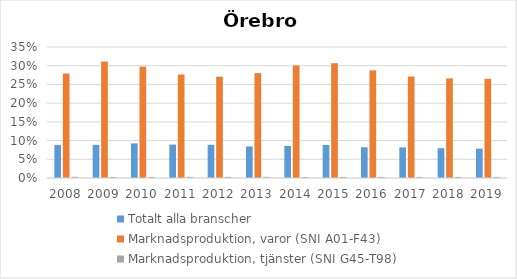
| Category | Totalt alla branscher | Marknadsproduktion, varor (SNI A01-F43) | Marknadsproduktion, tjänster (SNI G45-T98) |
|---|---|---|---|
| 2008 | 0.088 | 0.279 | 0.003 |
| 2009 | 0.088 | 0.311 | 0.003 |
| 2010 | 0.092 | 0.297 | 0.003 |
| 2011 | 0.089 | 0.276 | 0.003 |
| 2012 | 0.089 | 0.271 | 0.003 |
| 2013 | 0.084 | 0.28 | 0.003 |
| 2014 | 0.086 | 0.301 | 0.003 |
| 2015 | 0.088 | 0.307 | 0.003 |
| 2016 | 0.082 | 0.288 | 0.003 |
| 2017 | 0.082 | 0.271 | 0.003 |
| 2018 | 0.08 | 0.266 | 0.003 |
| 2019 | 0.078 | 0.265 | 0.003 |